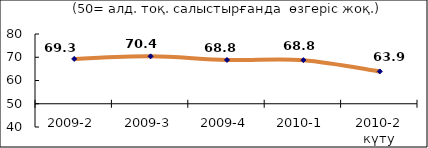
| Category | Диф.индекс ↓ |
|---|---|
| 2009-2 | 69.275 |
| 2009-3 | 70.385 |
| 2009-4 | 68.825 |
| 2010-1 | 68.76 |
| 2010-2 күту | 63.895 |